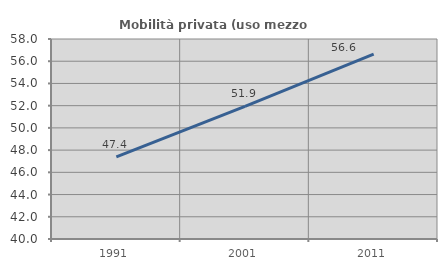
| Category | Mobilità privata (uso mezzo privato) |
|---|---|
| 1991.0 | 47.396 |
| 2001.0 | 51.943 |
| 2011.0 | 56.629 |